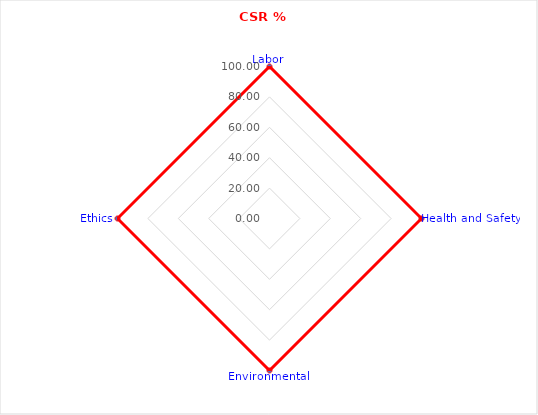
| Category | % Compliance |
|---|---|
| Labor | 100 |
| Health and Safety | 100 |
| Environmental | 100 |
| Ethics | 100 |